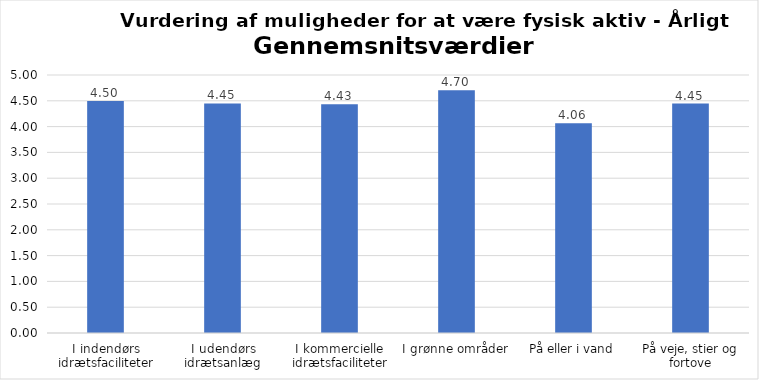
| Category | Gennemsnit |
|---|---|
| I indendørs idrætsfaciliteter | 4.497 |
| I udendørs idrætsanlæg | 4.449 |
| I kommercielle idrætsfaciliteter | 4.433 |
| I grønne områder | 4.702 |
| På eller i vand | 4.064 |
| På veje, stier og fortove | 4.447 |